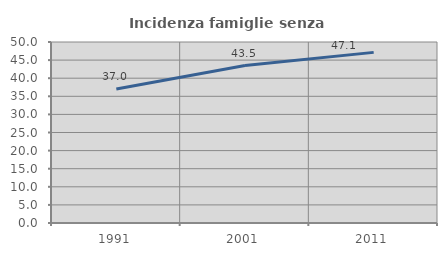
| Category | Incidenza famiglie senza nuclei |
|---|---|
| 1991.0 | 37.013 |
| 2001.0 | 43.506 |
| 2011.0 | 47.134 |